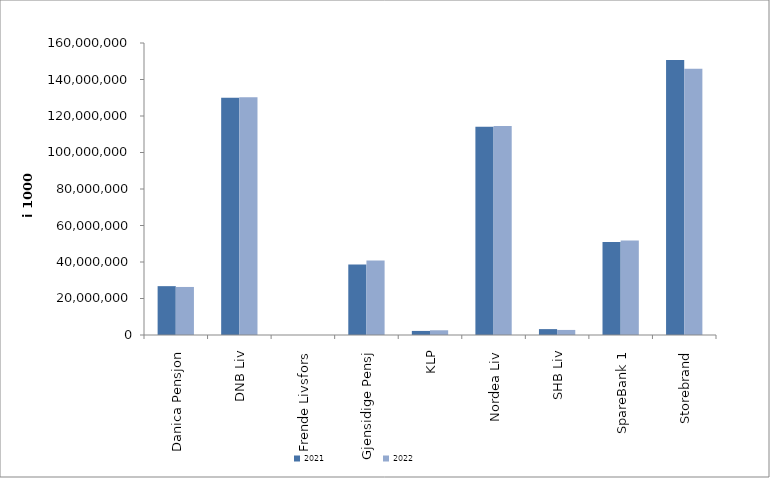
| Category | 2021 | 2022 |
|---|---|---|
| Danica Pensjon | 26763939.773 | 26321708.567 |
| DNB Liv | 129966187.129 | 130260212 |
| Frende Livsfors | 0 | 0 |
| Gjensidige Pensj | 38652190 | 40777682 |
| KLP | 2232813.013 | 2589206.35 |
| Nordea Liv | 114051500 | 114500280 |
| SHB Liv | 3229114.563 | 2775030.137 |
| SpareBank 1 | 50948452.248 | 51842088.698 |
| Storebrand | 150707923.691 | 145912125.619 |